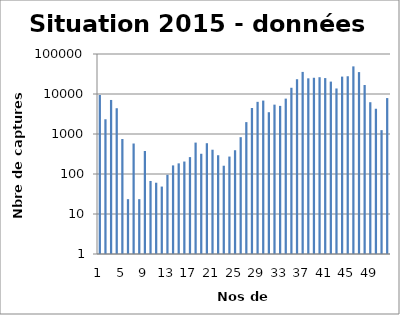
| Category | Series 0 |
|---|---|
| 0 | 9449 |
| 1 | 2335.5 |
| 2 | 7093.5 |
| 3 | 4408 |
| 4 | 749.5 |
| 5 | 23.5 |
| 6 | 578.5 |
| 7 | 23.5 |
| 8 | 376 |
| 9 | 67 |
| 10 | 60.5 |
| 11 | 48.5 |
| 12 | 95.5 |
| 13 | 164 |
| 14 | 184.5 |
| 15 | 205 |
| 16 | 264.5 |
| 17 | 609.5 |
| 18 | 320.5 |
| 19 | 588.5 |
| 20 | 404.5 |
| 21 | 294.5 |
| 22 | 161 |
| 23 | 273 |
| 24 | 393 |
| 25 | 833.25 |
| 26 | 1981.85 |
| 27 | 4460.85 |
| 28 | 6367.85 |
| 29 | 6848 |
| 30 | 3504 |
| 31 | 5418 |
| 32 | 5046 |
| 33 | 7666 |
| 34 | 14320 |
| 35 | 23410 |
| 36 | 35668.5 |
| 37 | 24653.5 |
| 38 | 25459.5 |
| 39 | 26280 |
| 40 | 25006 |
| 41 | 20414 |
| 42 | 13754 |
| 43 | 27215 |
| 44 | 27788.5 |
| 45 | 49047.5 |
| 46 | 35269 |
| 47 | 16764 |
| 48 | 6234 |
| 49 | 4280 |
| 50 | 1249 |
| 51 | 7911 |